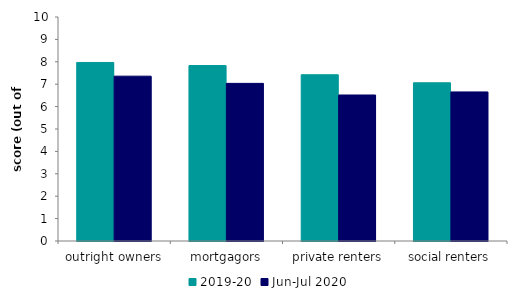
| Category | 2019-20 | Jun-Jul 2020 |
|---|---|---|
| outright owners | 7.97 | 7.359 |
| mortgagors | 7.834 | 7.037 |
| private renters | 7.422 | 6.518 |
| social renters | 7.064 | 6.655 |